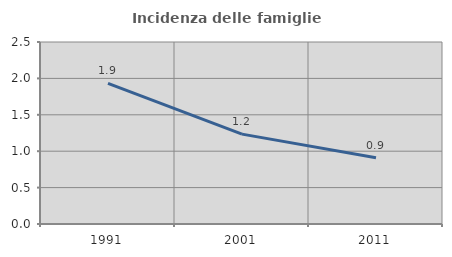
| Category | Incidenza delle famiglie numerose |
|---|---|
| 1991.0 | 1.932 |
| 2001.0 | 1.235 |
| 2011.0 | 0.911 |